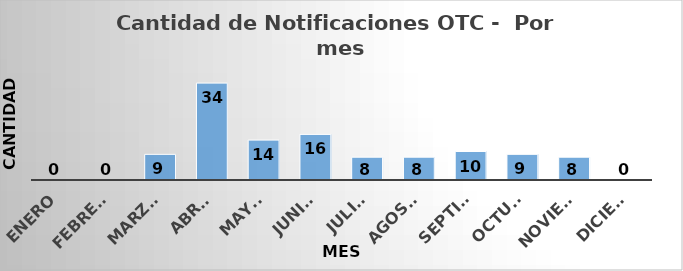
| Category | Cantidad de Notificaciones OTC
 Por mes
Marzo - Diciembre de 2020 |
|---|---|
| Enero | 0 |
| Febrero | 0 |
| Marzo | 9 |
| Abril | 34 |
| Mayo | 14 |
| Junio | 16 |
| Julio | 8 |
| Agosto | 8 |
| Septiembre | 10 |
| Octubre | 9 |
| Noviembre | 8 |
| Diciembre | 0 |